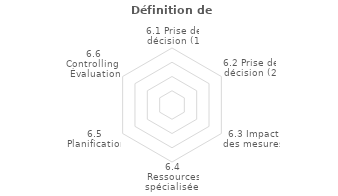
| Category | Series 2 |
|---|---|
| 6.1 Prise de décision (1) | 0 |
| 6.2 Prise de décision (2) | 0 |
| 6.3 Impact des mesures | 0 |
| 6.4 Ressources spécialisées | 0 |
| 6.5 Planification | 0 |
| 6.6 Controlling / Évaluation | 0 |